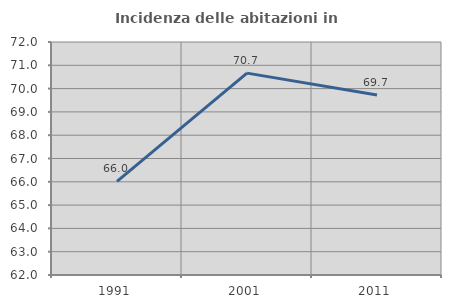
| Category | Incidenza delle abitazioni in proprietà  |
|---|---|
| 1991.0 | 66.02 |
| 2001.0 | 70.664 |
| 2011.0 | 69.729 |